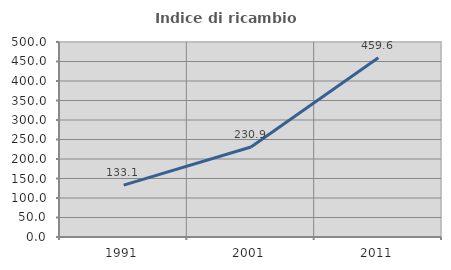
| Category | Indice di ricambio occupazionale  |
|---|---|
| 1991.0 | 133.108 |
| 2001.0 | 230.864 |
| 2011.0 | 459.574 |